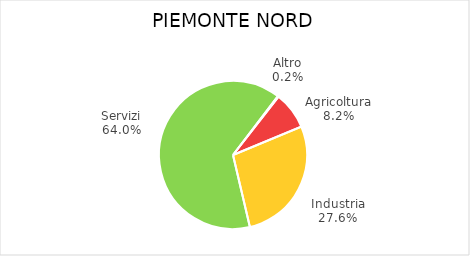
| Category | Piemonte Nord |
|---|---|
| Agricoltura | 6985 |
| Industria | 23588 |
| Servizi | 54726 |
| Altro | 157 |